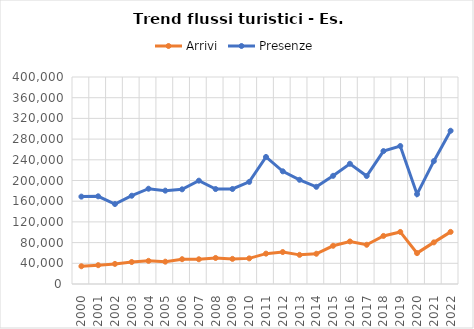
| Category | Arrivi | Presenze |
|---|---|---|
| 2000.0 | 34300 | 168849 |
| 2001.0 | 36361 | 169439 |
| 2002.0 | 38831 | 154542 |
| 2003.0 | 42462 | 170561 |
| 2004.0 | 44700 | 184103 |
| 2005.0 | 43126 | 180404 |
| 2006.0 | 47939 | 182939 |
| 2007.0 | 47804 | 199657 |
| 2008.0 | 50311 | 183492 |
| 2009.0 | 48545 | 183580 |
| 2010.0 | 49513 | 197291 |
| 2011.0 | 58676 | 245504 |
| 2012.0 | 61727 | 217749 |
| 2013.0 | 56311 | 201370 |
| 2014.0 | 58483 | 187784 |
| 2015.0 | 73873 | 209034 |
| 2016.0 | 82214 | 232329 |
| 2017.0 | 75808 | 208700 |
| 2018.0 | 92888 | 256845 |
| 2019.0 | 100592 | 266644 |
| 2020.0 | 59645 | 173598 |
| 2021.0 | 80419 | 237384 |
| 2022.0 | 100687 | 296131 |